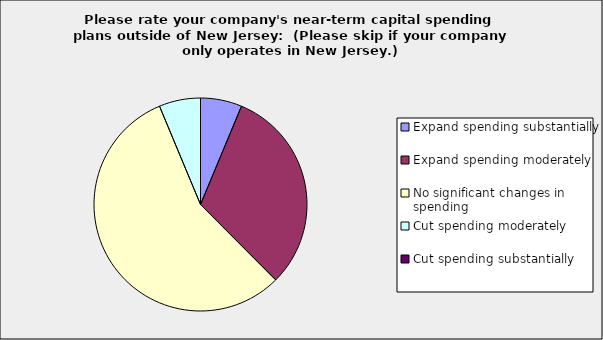
| Category | Series 0 |
|---|---|
| Expand spending substantially | 0.063 |
| Expand spending moderately | 0.313 |
| No significant changes in spending | 0.563 |
| Cut spending moderately | 0.063 |
| Cut spending substantially | 0 |